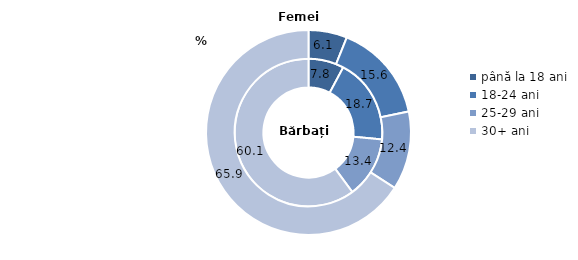
| Category | Băbați | Femei |
|---|---|---|
| până la 18 ani | 7.8 | 6.1 |
| 18-24 ani | 18.7 | 15.6 |
| 25-29 ani | 13.4 | 12.4 |
| 30+ ani | 60.1 | 65.9 |